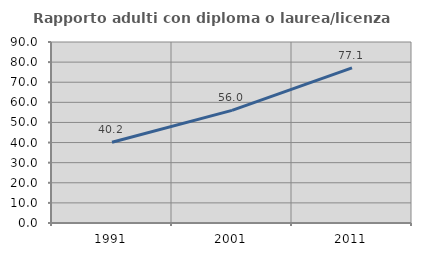
| Category | Rapporto adulti con diploma o laurea/licenza media  |
|---|---|
| 1991.0 | 40.152 |
| 2001.0 | 55.987 |
| 2011.0 | 77.106 |